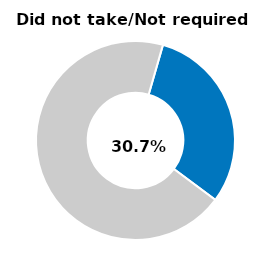
| Category | Series 0 |
|---|---|
| Did not take/not required | 0.307 |
| Other | 0.693 |